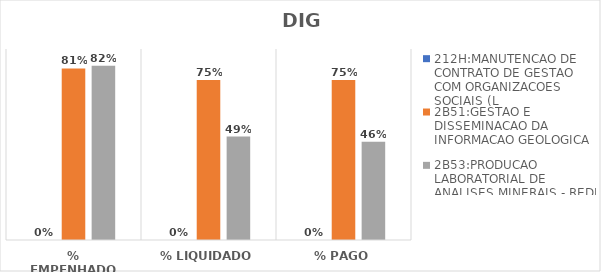
| Category | 212H:MANUTENCAO DE CONTRATO DE GESTAO COM ORGANIZACOES SOCIAIS (L | 2B51:GESTAO E DISSEMINACAO DA INFORMACAO GEOLOGICA | 2B53:PRODUCAO LABORATORIAL DE ANALISES MINERAIS - REDE LAMIN |
|---|---|---|---|
| % EMPENHADO | 0 | 0.808 | 0.822 |
| % LIQUIDADO | 0 | 0.754 | 0.487 |
| % PAGO | 0 | 0.754 | 0.463 |